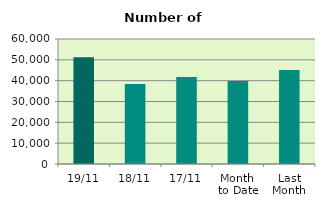
| Category | Series 0 |
|---|---|
| 19/11 | 51200 |
| 18/11 | 38426 |
| 17/11 | 41760 |
| Month 
to Date | 39880.933 |
| Last
Month | 45060.857 |